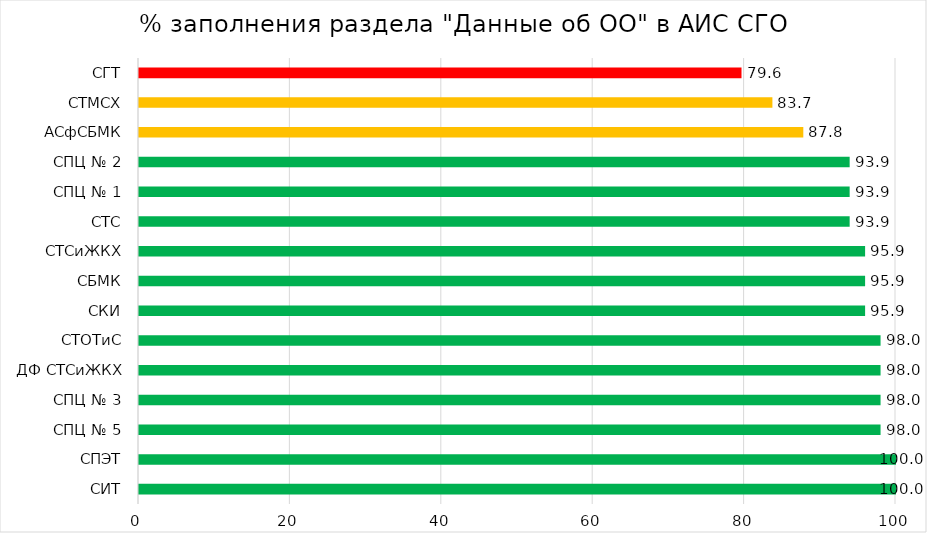
| Category | Series 0 |
|---|---|
| СИТ | 100 |
| СПЭТ | 100 |
| СПЦ № 5 | 97.959 |
| СПЦ № 3 | 97.959 |
| ДФ СТСиЖКХ | 97.959 |
| СТОТиС | 97.959 |
| СКИ | 95.918 |
| СБМК | 95.918 |
| СТСиЖКХ | 95.918 |
| СТС | 93.878 |
| СПЦ № 1 | 93.878 |
| СПЦ № 2 | 93.878 |
| АСфСБМК | 87.755 |
| СТМСХ | 83.673 |
| СГТ | 79.592 |